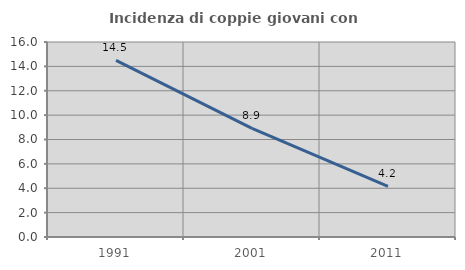
| Category | Incidenza di coppie giovani con figli |
|---|---|
| 1991.0 | 14.498 |
| 2001.0 | 8.916 |
| 2011.0 | 4.162 |